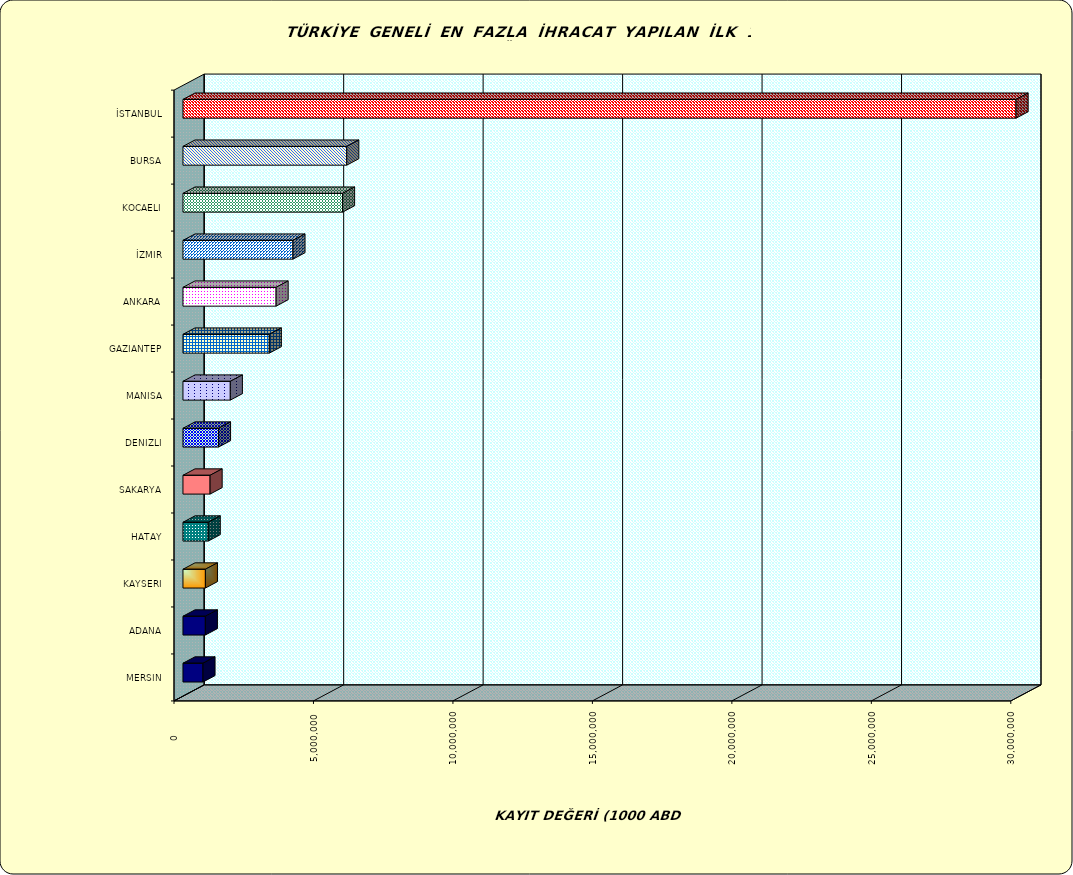
| Category | Series 0 |
|---|---|
| İSTANBUL | 29867485.44 |
| BURSA | 5871578.918 |
| KOCAELI | 5720850.617 |
| İZMIR | 3943294.713 |
| ANKARA | 3339379.327 |
| GAZIANTEP | 3095590.986 |
| MANISA | 1697612.152 |
| DENIZLI | 1273638.931 |
| SAKARYA | 972503.815 |
| HATAY | 905969.885 |
| KAYSERI | 804273.159 |
| ADANA | 802521.211 |
| MERSIN | 718097.514 |